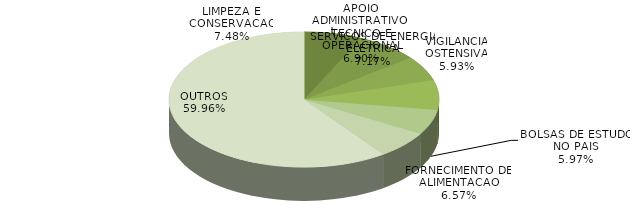
| Category | Series 0 | Series 1 |
|---|---|---|
| APOIO ADMINISTRATIVO, TECNICO E OPERACIONAL | 3043389.89 | 0.069 |
| LIMPEZA E CONSERVACAO | 3299211.27 | 0.075 |
| VIGILANCIA OSTENSIVA | 2616052.3 | 0.059 |
| SERVICOS DE ENERGIA ELETRICA | 3161340.64 | 0.072 |
| BOLSAS DE ESTUDO NO PAIS | 2631512 | 0.06 |
| FORNECIMENTO DE ALIMENTACAO | 2898442.19 | 0.066 |
| OUTROS | 26433604.78 | 0.6 |